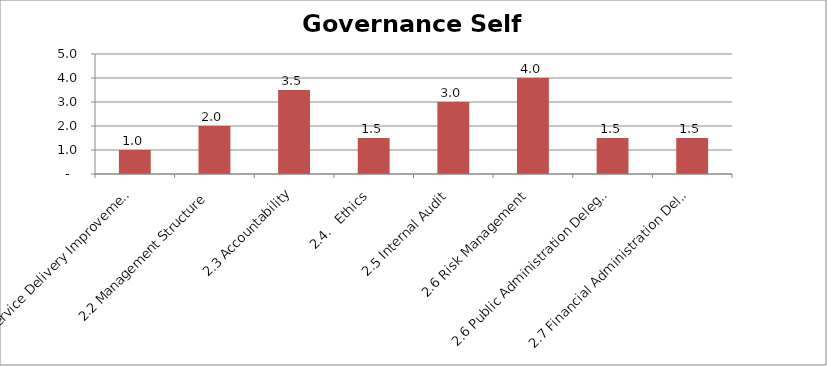
| Category | Secondary data analysis | Self assess |
|---|---|---|
| 2.1 Service Delivery Improvement |  | 1 |
| 2.2 Management Structure |  | 2 |
| 2.3 Accountability |  | 3.5 |
| 2.4.   Ethics |  | 1.5 |
| 2.5 Internal Audit |  | 3 |
| 2.6 Risk Management |  | 4 |
| 2.6 Public Administration Delegations |  | 1.5 |
| 2.7 Financial Administration Delegations |  | 1.5 |